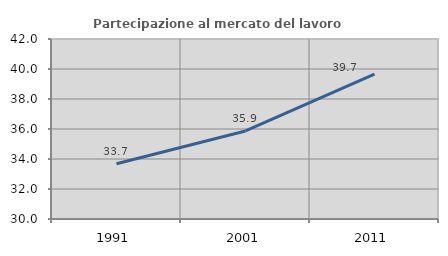
| Category | Partecipazione al mercato del lavoro  femminile |
|---|---|
| 1991.0 | 33.678 |
| 2001.0 | 35.871 |
| 2011.0 | 39.651 |